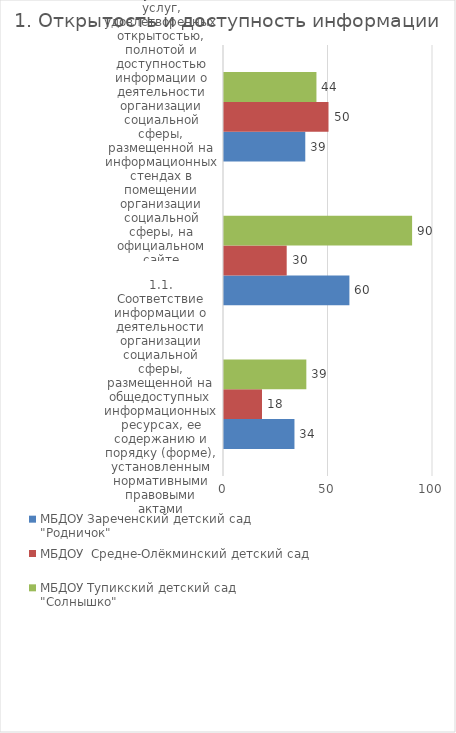
| Category | МБДОУ Зареченский детский сад  "Родничок" | МБДОУ  Средне-Олёкминский детский сад  | МБДОУ Тупикский детский сад  "Солнышко" |
|---|---|---|---|
| 1.1. Соответствие информации о деятельности организации социальной сферы, размещенной на общедоступных информационных ресурсах, ее содержанию и порядку (форме), установленным нормативными правовыми актами | 33.712 | 18.182 | 39.394 |
| 1.2. Наличие на официальном сайте организации социальной сферы информации о дистанционных способах обратной связи и взаимодействия с получателями услуг и их функционирование | 60 | 30 | 90 |
| 1.3. Доля получателей услуг, удовлетворенных открытостью, полнотой и доступностью информации о деятельности организации социальной сферы, размещенной на информационных стендах в помещении организации социальной сферы, на официальном сайте организации социа | 38.889 | 50 | 44.231 |